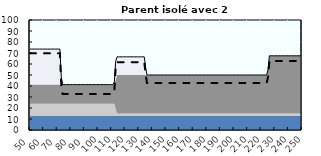
| Category | Coin fiscal marginal (somme des composantes) | Taux d’imposition marginal net |
|---|---|---|
| 50.0 | 73.575 | 69.733 |
| 51.0 | 73.575 | 69.733 |
| 52.0 | 73.575 | 69.733 |
| 53.0 | 73.575 | 69.733 |
| 54.0 | 73.575 | 69.733 |
| 55.0 | 73.575 | 69.733 |
| 56.0 | 73.575 | 69.733 |
| 57.0 | 73.575 | 69.733 |
| 58.0 | 73.575 | 69.733 |
| 59.0 | 73.575 | 69.733 |
| 60.0 | 73.575 | 69.733 |
| 61.0 | 73.575 | 69.733 |
| 62.0 | 73.575 | 69.733 |
| 63.0 | 73.575 | 69.733 |
| 64.0 | 73.575 | 69.733 |
| 65.0 | 73.575 | 69.733 |
| 66.0 | 73.575 | 69.733 |
| 67.0 | 73.575 | 69.733 |
| 68.0 | 73.575 | 69.733 |
| 69.0 | 73.575 | 69.733 |
| 70.0 | 73.575 | 69.733 |
| 71.0 | 73.575 | 69.733 |
| 72.0 | 73.575 | 69.733 |
| 73.0 | 48.24 | 40.714 |
| 74.0 | 41.278 | 32.74 |
| 75.0 | 41.278 | 32.74 |
| 76.0 | 41.278 | 32.74 |
| 77.0 | 41.278 | 32.74 |
| 78.0 | 41.278 | 32.74 |
| 79.0 | 41.278 | 32.74 |
| 80.0 | 41.278 | 32.74 |
| 81.0 | 41.278 | 32.74 |
| 82.0 | 41.278 | 32.74 |
| 83.0 | 41.278 | 32.74 |
| 84.0 | 41.278 | 32.74 |
| 85.0 | 41.278 | 32.74 |
| 86.0 | 41.278 | 32.74 |
| 87.0 | 41.278 | 32.74 |
| 88.0 | 41.278 | 32.74 |
| 89.0 | 41.278 | 32.74 |
| 90.0 | 41.278 | 32.74 |
| 91.0 | 41.278 | 32.74 |
| 92.0 | 41.278 | 32.74 |
| 93.0 | 41.278 | 32.74 |
| 94.0 | 41.278 | 32.74 |
| 95.0 | 41.278 | 32.74 |
| 96.0 | 41.278 | 32.74 |
| 97.0 | 41.278 | 32.74 |
| 98.0 | 41.278 | 32.74 |
| 99.0 | 41.278 | 32.74 |
| 100.0 | 41.278 | 32.74 |
| 101.0 | 41.278 | 32.74 |
| 102.0 | 41.278 | 32.74 |
| 103.0 | 41.278 | 32.74 |
| 104.0 | 41.278 | 32.74 |
| 105.0 | 41.278 | 32.74 |
| 106.0 | 41.278 | 32.74 |
| 107.0 | 41.278 | 32.74 |
| 108.0 | 41.278 | 32.74 |
| 109.0 | 41.278 | 32.74 |
| 110.0 | 41.278 | 32.74 |
| 111.0 | 41.278 | 32.74 |
| 112.0 | 43.491 | 35.274 |
| 113.0 | 62.361 | 56.888 |
| 114.0 | 66.511 | 61.642 |
| 115.0 | 66.511 | 61.642 |
| 116.0 | 66.511 | 61.642 |
| 117.0 | 66.511 | 61.642 |
| 118.0 | 66.511 | 61.642 |
| 119.0 | 66.511 | 61.642 |
| 120.0 | 66.511 | 61.642 |
| 121.0 | 66.511 | 61.642 |
| 122.0 | 66.511 | 61.642 |
| 123.0 | 66.511 | 61.642 |
| 124.0 | 66.511 | 61.642 |
| 125.0 | 66.511 | 61.642 |
| 126.0 | 66.511 | 61.642 |
| 127.0 | 66.511 | 61.642 |
| 128.0 | 66.511 | 61.642 |
| 129.0 | 66.511 | 61.642 |
| 130.0 | 66.511 | 61.642 |
| 131.0 | 66.511 | 61.642 |
| 132.0 | 66.511 | 61.642 |
| 133.0 | 66.511 | 61.642 |
| 134.0 | 66.511 | 61.642 |
| 135.0 | 57.255 | 51.04 |
| 136.0 | 50.009 | 42.74 |
| 137.0 | 50.009 | 42.74 |
| 138.0 | 50.009 | 42.74 |
| 139.0 | 50.009 | 42.74 |
| 140.0 | 50.009 | 42.74 |
| 141.0 | 50.009 | 42.74 |
| 142.0 | 50.009 | 42.74 |
| 143.0 | 50.009 | 42.74 |
| 144.0 | 50.009 | 42.74 |
| 145.0 | 50.009 | 42.74 |
| 146.0 | 50.009 | 42.74 |
| 147.0 | 50.009 | 42.74 |
| 148.0 | 50.009 | 42.74 |
| 149.0 | 50.009 | 42.74 |
| 150.0 | 50.009 | 42.74 |
| 151.0 | 50.009 | 42.74 |
| 152.0 | 50.009 | 42.74 |
| 153.0 | 50.009 | 42.74 |
| 154.0 | 50.009 | 42.74 |
| 155.0 | 50.009 | 42.74 |
| 156.0 | 50.009 | 42.74 |
| 157.0 | 50.009 | 42.74 |
| 158.0 | 50.009 | 42.74 |
| 159.0 | 50.009 | 42.74 |
| 160.0 | 50.009 | 42.74 |
| 161.0 | 50.009 | 42.74 |
| 162.0 | 50.009 | 42.74 |
| 163.0 | 50.009 | 42.74 |
| 164.0 | 50.009 | 42.74 |
| 165.0 | 50.009 | 42.74 |
| 166.0 | 50.009 | 42.74 |
| 167.0 | 50.009 | 42.74 |
| 168.0 | 50.009 | 42.74 |
| 169.0 | 50.009 | 42.74 |
| 170.0 | 50.009 | 42.74 |
| 171.0 | 50.009 | 42.74 |
| 172.0 | 50.009 | 42.74 |
| 173.0 | 50.009 | 42.74 |
| 174.0 | 50.009 | 42.74 |
| 175.0 | 50.009 | 42.74 |
| 176.0 | 50.009 | 42.74 |
| 177.0 | 50.009 | 42.74 |
| 178.0 | 50.009 | 42.74 |
| 179.0 | 50.009 | 42.74 |
| 180.0 | 50.009 | 42.74 |
| 181.0 | 50.009 | 42.74 |
| 182.0 | 50.009 | 42.74 |
| 183.0 | 50.009 | 42.74 |
| 184.0 | 50.009 | 42.74 |
| 185.0 | 50.009 | 42.74 |
| 186.0 | 50.009 | 42.74 |
| 187.0 | 50.009 | 42.74 |
| 188.0 | 50.009 | 42.74 |
| 189.0 | 50.009 | 42.74 |
| 190.0 | 50.009 | 42.74 |
| 191.0 | 50.009 | 42.74 |
| 192.0 | 50.009 | 42.74 |
| 193.0 | 50.009 | 42.74 |
| 194.0 | 50.009 | 42.74 |
| 195.0 | 50.009 | 42.74 |
| 196.0 | 50.009 | 42.74 |
| 197.0 | 50.009 | 42.74 |
| 198.0 | 50.009 | 42.74 |
| 199.0 | 50.009 | 42.74 |
| 200.0 | 50.009 | 42.74 |
| 201.0 | 50.009 | 42.74 |
| 202.0 | 50.009 | 42.74 |
| 203.0 | 50.009 | 42.74 |
| 204.0 | 50.009 | 42.74 |
| 205.0 | 50.009 | 42.74 |
| 206.0 | 50.009 | 42.74 |
| 207.0 | 50.009 | 42.74 |
| 208.0 | 50.009 | 42.74 |
| 209.0 | 50.009 | 42.74 |
| 210.0 | 50.009 | 42.74 |
| 211.0 | 50.009 | 42.74 |
| 212.0 | 50.009 | 42.74 |
| 213.0 | 50.009 | 42.74 |
| 214.0 | 50.009 | 42.74 |
| 215.0 | 50.009 | 42.74 |
| 216.0 | 50.009 | 42.74 |
| 217.0 | 50.009 | 42.74 |
| 218.0 | 50.009 | 42.74 |
| 219.0 | 50.009 | 42.74 |
| 220.0 | 50.009 | 42.74 |
| 221.0 | 50.009 | 42.74 |
| 222.0 | 50.009 | 42.74 |
| 223.0 | 50.009 | 42.74 |
| 224.0 | 50.009 | 42.74 |
| 225.0 | 54.691 | 48.103 |
| 226.0 | 67.47 | 62.74 |
| 227.0 | 67.47 | 62.74 |
| 228.0 | 67.47 | 62.74 |
| 229.0 | 67.47 | 62.74 |
| 230.0 | 67.47 | 62.74 |
| 231.0 | 67.47 | 62.74 |
| 232.0 | 67.47 | 62.74 |
| 233.0 | 67.47 | 62.74 |
| 234.0 | 67.47 | 62.74 |
| 235.0 | 67.47 | 62.74 |
| 236.0 | 67.47 | 62.74 |
| 237.0 | 67.47 | 62.74 |
| 238.0 | 67.47 | 62.74 |
| 239.0 | 67.47 | 62.74 |
| 240.0 | 67.47 | 62.74 |
| 241.0 | 67.47 | 62.74 |
| 242.0 | 67.47 | 62.74 |
| 243.0 | 67.47 | 62.74 |
| 244.0 | 67.47 | 62.74 |
| 245.0 | 67.47 | 62.74 |
| 246.0 | 67.47 | 62.74 |
| 247.0 | 67.47 | 62.74 |
| 248.0 | 67.47 | 62.74 |
| 249.0 | 67.47 | 62.74 |
| 250.0 | 67.47 | 62.74 |